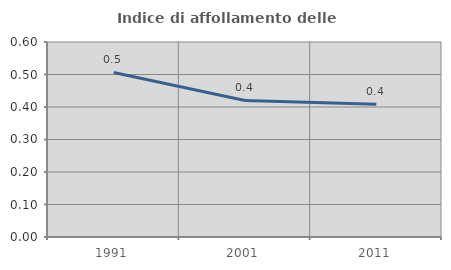
| Category | Indice di affollamento delle abitazioni  |
|---|---|
| 1991.0 | 0.506 |
| 2001.0 | 0.42 |
| 2011.0 | 0.408 |